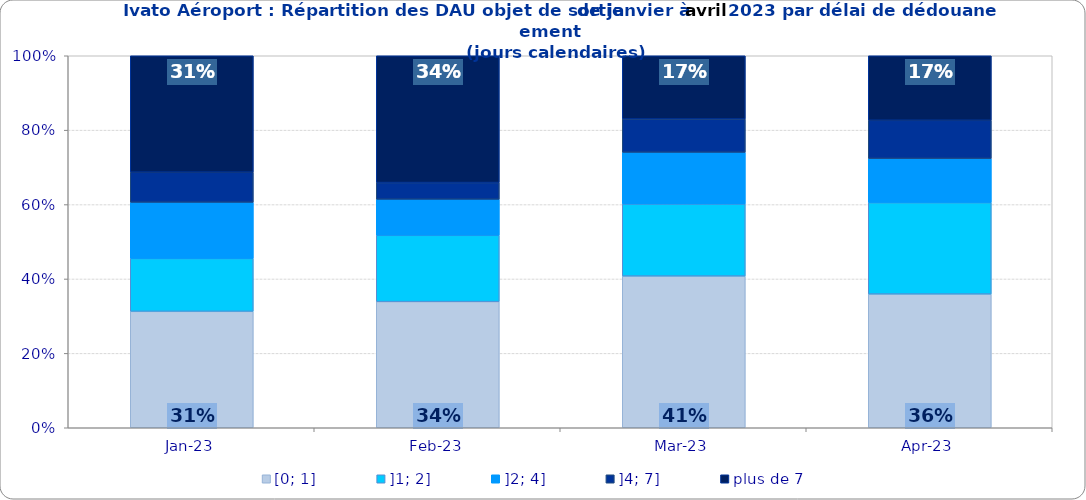
| Category | [0; 1] | ]1; 2] | ]2; 4] | ]4; 7] | plus de 7 |
|---|---|---|---|---|---|
| 2023-01-01 | 0.313 | 0.142 | 0.151 | 0.081 | 0.313 |
| 2023-02-01 | 0.339 | 0.178 | 0.097 | 0.045 | 0.341 |
| 2023-03-01 | 0.408 | 0.194 | 0.139 | 0.09 | 0.17 |
| 2023-04-01 | 0.359 | 0.246 | 0.119 | 0.103 | 0.173 |